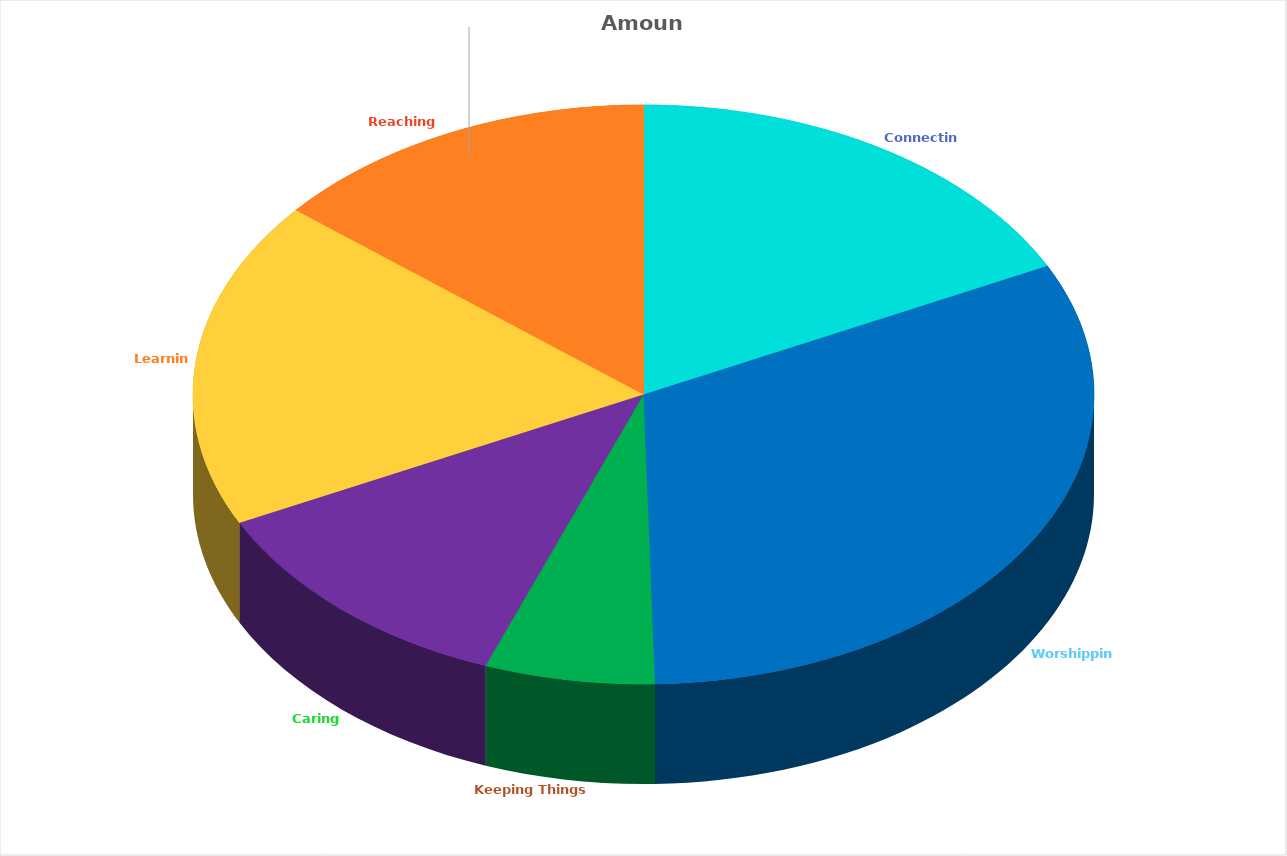
| Category | Amount |
|---|---|
| Connecting | 87000 |
| Worshipping | 157000 |
| Keeping Things Running | 30000 |
| Caring | 59000 |
| Learning | 90000 |
| Reaching Out | 69000 |